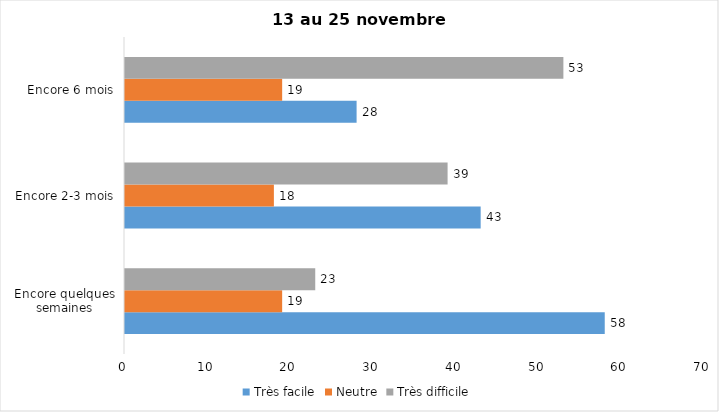
| Category | Très facile | Neutre | Très difficile |
|---|---|---|---|
| Encore quelques semaines | 58 | 19 | 23 |
| Encore 2-3 mois | 43 | 18 | 39 |
| Encore 6 mois | 28 | 19 | 53 |